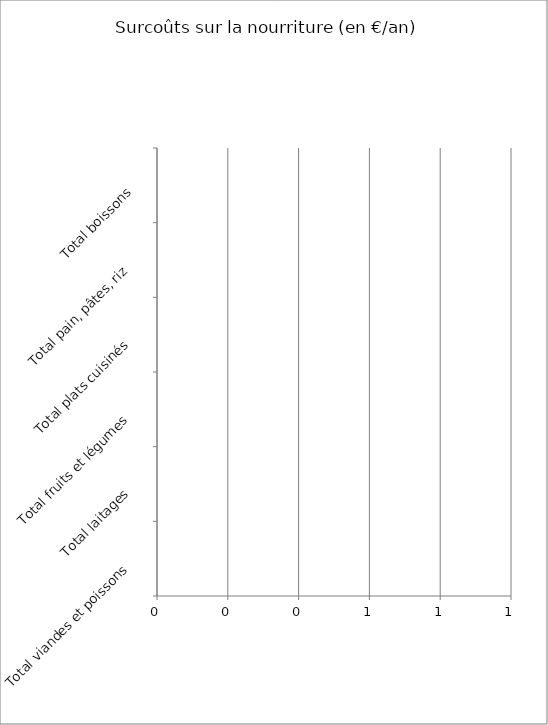
| Category | Series 0 |
|---|---|
| Total viandes et poissons | 0 |
| Total laitages | 0 |
| Total fruits et légumes | 0 |
| Total plats cuisinés | 0 |
| Total pain, pâtes, riz | 0 |
| Total boissons | 0 |